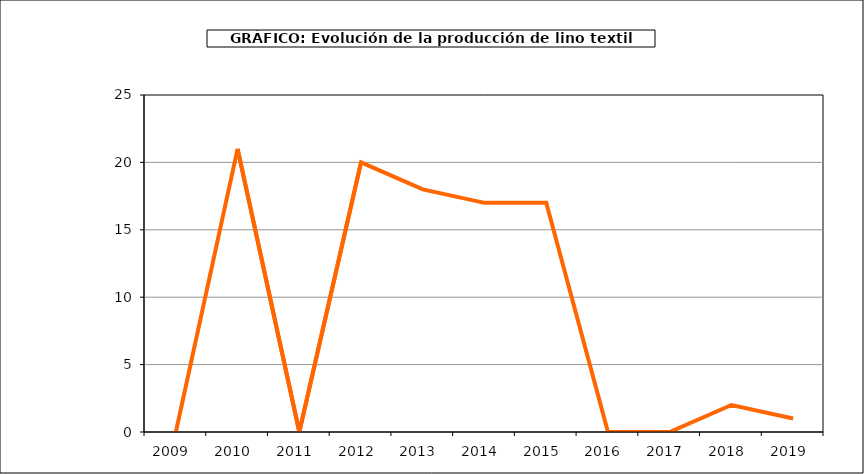
| Category | producción |
|---|---|
| 2009.0 | 0 |
| 2010.0 | 21 |
| 2011.0 | 0 |
| 2012.0 | 20 |
| 2013.0 | 18 |
| 2014.0 | 17 |
| 2015.0 | 17 |
| 2016.0 | 0 |
| 2017.0 | 0 |
| 2018.0 | 2 |
| 2019.0 | 1 |